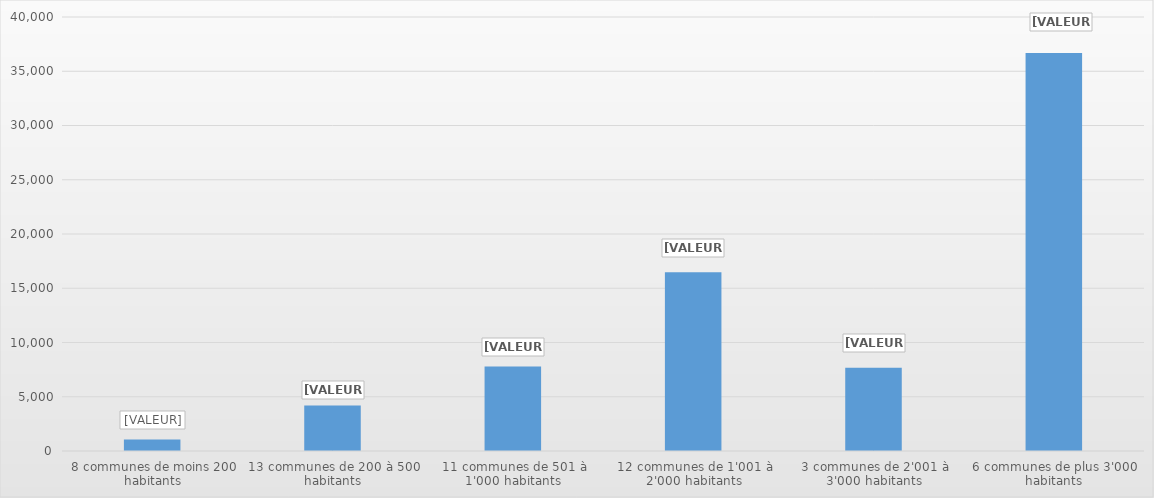
| Category | Series 0 |
|---|---|
| 8 communes de moins 200 habitants | 1066 |
| 13 communes de 200 à 500 habitants | 4185 |
| 11 communes de 501 à 1'000 habitants | 7789 |
| 12 communes de 1'001 à 2'000 habitants | 16481 |
| 3 communes de 2'001 à 3'000 habitants | 7664 |
| 6 communes de plus 3'000 habitants | 36680 |